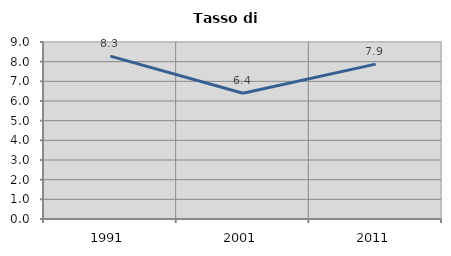
| Category | Tasso di disoccupazione   |
|---|---|
| 1991.0 | 8.28 |
| 2001.0 | 6.396 |
| 2011.0 | 7.877 |